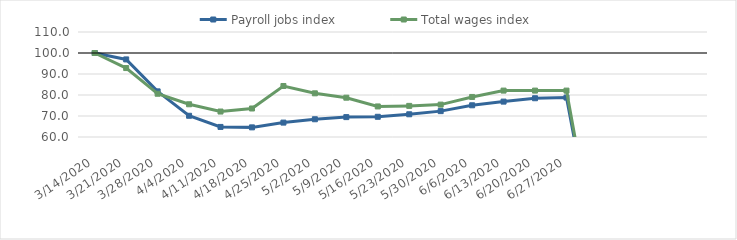
| Category | Payroll jobs index | Total wages index |
|---|---|---|
| 14/03/2020 | 100 | 100 |
| 21/03/2020 | 96.943 | 92.829 |
| 28/03/2020 | 81.728 | 80.602 |
| 04/04/2020 | 70.111 | 75.585 |
| 11/04/2020 | 64.797 | 72.123 |
| 18/04/2020 | 64.584 | 73.578 |
| 25/04/2020 | 66.858 | 84.288 |
| 02/05/2020 | 68.451 | 80.797 |
| 09/05/2020 | 69.468 | 78.715 |
| 16/05/2020 | 69.622 | 74.55 |
| 23/05/2020 | 70.819 | 74.82 |
| 30/05/2020 | 72.32 | 75.418 |
| 06/06/2020 | 75.103 | 79.077 |
| 13/06/2020 | 76.851 | 82.097 |
| 20/06/2020 | 78.458 | 82.098 |
| 27/06/2020 | 78.783 | 82.095 |